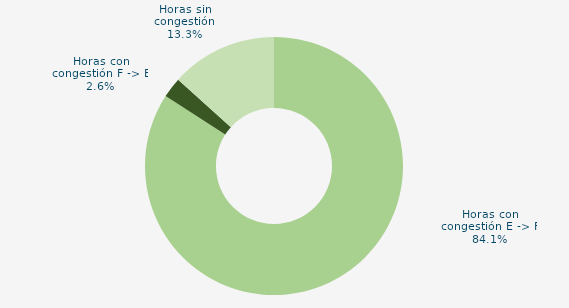
| Category | Horas con congestión E -> F |
|---|---|
| Horas con congestión E -> F | 84.118 |
| Horas con congestión F -> E | 2.557 |
| Horas sin congestión | 13.324 |